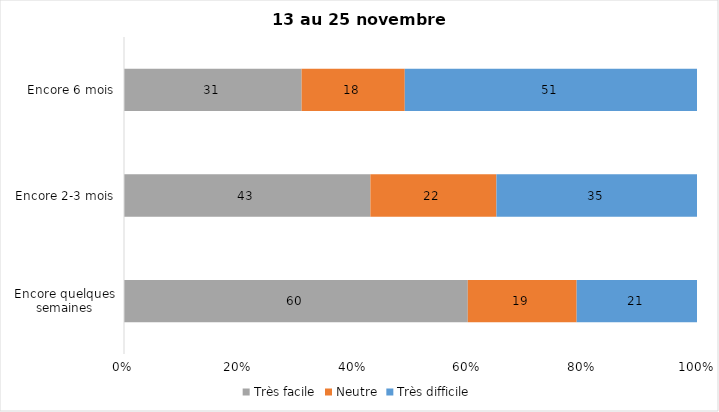
| Category | Très facile | Neutre | Très difficile |
|---|---|---|---|
| Encore quelques semaines | 60 | 19 | 21 |
| Encore 2-3 mois | 43 | 22 | 35 |
| Encore 6 mois | 31 | 18 | 51 |